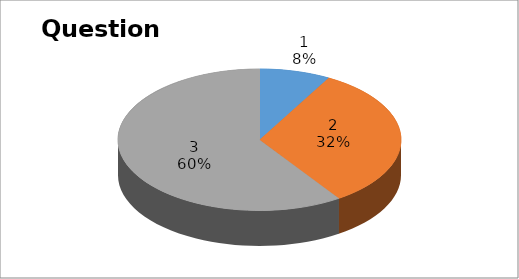
| Category | Series 0 |
|---|---|
| 0 | 3 |
| 1 | 12 |
| 2 | 22 |